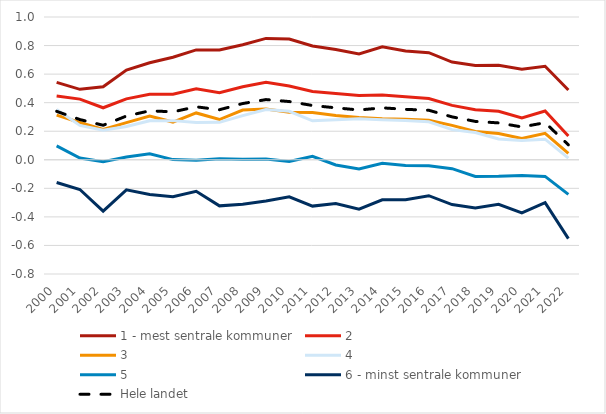
| Category | 1 - mest sentrale kommuner | 2 | 3 | 4 | 5 | 6 - minst sentrale kommuner | Hele landet |
|---|---|---|---|---|---|---|---|
| 2000.0 | 0.543 | 0.447 | 0.313 | 0.353 | 0.097 | -0.159 | 0.339 |
| 2001.0 | 0.493 | 0.425 | 0.261 | 0.241 | 0.013 | -0.208 | 0.282 |
| 2002.0 | 0.512 | 0.364 | 0.212 | 0.207 | -0.014 | -0.36 | 0.242 |
| 2003.0 | 0.629 | 0.426 | 0.26 | 0.234 | 0.02 | -0.211 | 0.306 |
| 2004.0 | 0.679 | 0.459 | 0.306 | 0.273 | 0.041 | -0.243 | 0.343 |
| 2005.0 | 0.719 | 0.46 | 0.264 | 0.274 | 0.001 | -0.259 | 0.336 |
| 2006.0 | 0.77 | 0.497 | 0.328 | 0.262 | -0.003 | -0.221 | 0.371 |
| 2007.0 | 0.769 | 0.47 | 0.282 | 0.262 | 0.007 | -0.323 | 0.35 |
| 2008.0 | 0.806 | 0.511 | 0.348 | 0.309 | 0.003 | -0.312 | 0.394 |
| 2009.0 | 0.85 | 0.542 | 0.355 | 0.352 | 0.005 | -0.289 | 0.422 |
| 2010.0 | 0.846 | 0.516 | 0.333 | 0.34 | -0.012 | -0.259 | 0.408 |
| 2011.0 | 0.798 | 0.479 | 0.332 | 0.273 | 0.024 | -0.324 | 0.38 |
| 2012.0 | 0.772 | 0.465 | 0.31 | 0.28 | -0.036 | -0.306 | 0.364 |
| 2013.0 | 0.741 | 0.45 | 0.297 | 0.287 | -0.065 | -0.346 | 0.349 |
| 2014.0 | 0.792 | 0.454 | 0.287 | 0.281 | -0.025 | -0.28 | 0.364 |
| 2015.0 | 0.761 | 0.442 | 0.283 | 0.275 | -0.04 | -0.279 | 0.353 |
| 2016.0 | 0.75 | 0.429 | 0.277 | 0.266 | -0.042 | -0.252 | 0.347 |
| 2017.0 | 0.685 | 0.381 | 0.241 | 0.211 | -0.062 | -0.313 | 0.301 |
| 2018.0 | 0.66 | 0.35 | 0.199 | 0.191 | -0.116 | -0.338 | 0.269 |
| 2019.0 | 0.662 | 0.339 | 0.185 | 0.145 | -0.116 | -0.312 | 0.258 |
| 2020.0 | 0.635 | 0.294 | 0.149 | 0.135 | -0.109 | -0.372 | 0.23 |
| 2021.0 | 0.655 | 0.341 | 0.185 | 0.144 | -0.116 | -0.3 | 0.26 |
| 2022.0 | 0.488 | 0.167 | 0.045 | 0.012 | -0.243 | -0.553 | 0.105 |